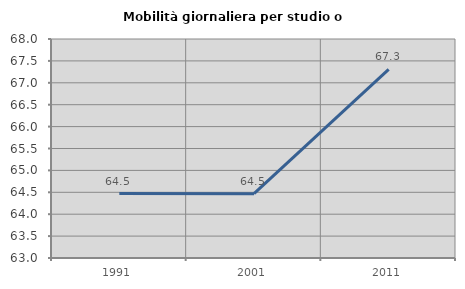
| Category | Mobilità giornaliera per studio o lavoro |
|---|---|
| 1991.0 | 64.47 |
| 2001.0 | 64.468 |
| 2011.0 | 67.306 |